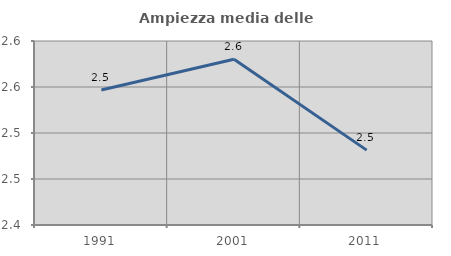
| Category | Ampiezza media delle famiglie |
|---|---|
| 1991.0 | 2.547 |
| 2001.0 | 2.58 |
| 2011.0 | 2.481 |